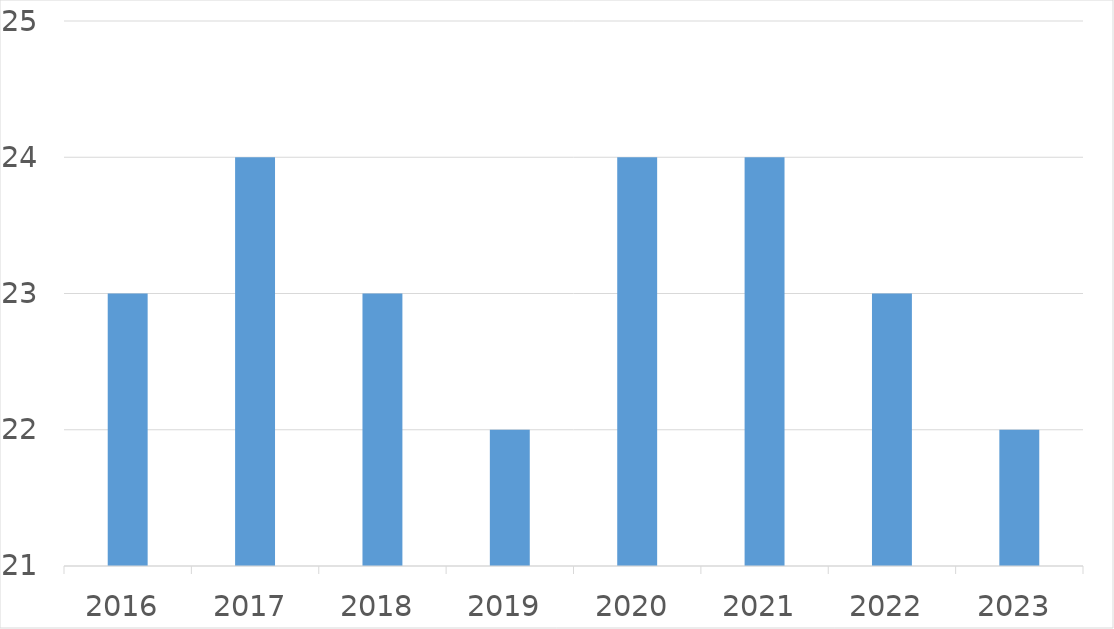
| Category | Series 0 |
|---|---|
| 2016 | 23 |
| 2017 | 24 |
| 2018 | 23 |
| 2019 | 22 |
| 2020 | 24 |
| 2021 | 24 |
| 2022 | 23 |
| 2023 | 22 |